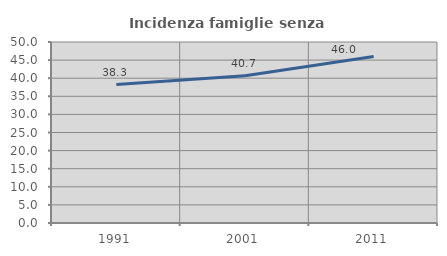
| Category | Incidenza famiglie senza nuclei |
|---|---|
| 1991.0 | 38.254 |
| 2001.0 | 40.687 |
| 2011.0 | 45.986 |